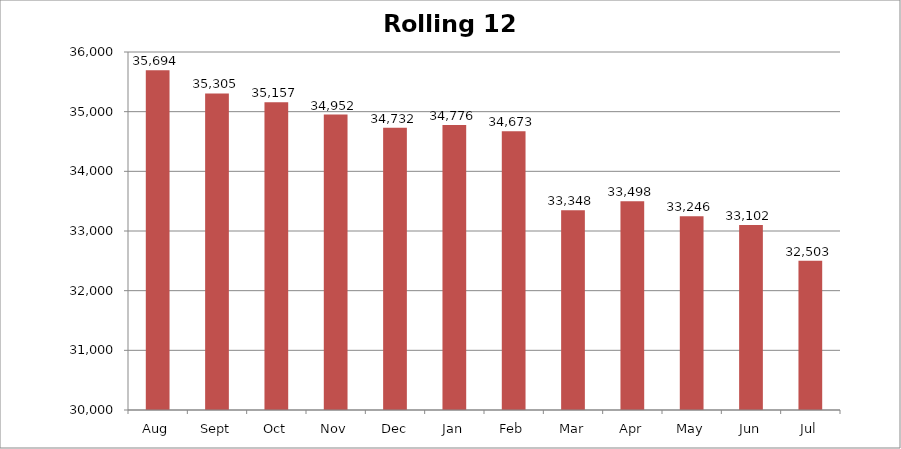
| Category | Rolling 12 Month |
|---|---|
| Aug | 35694 |
| Sept | 35305 |
| Oct | 35157 |
| Nov | 34952 |
| Dec | 34732 |
| Jan | 34776 |
| Feb | 34673 |
| Mar | 33348 |
| Apr | 33498 |
| May | 33246 |
| Jun | 33102 |
| Jul | 32503 |